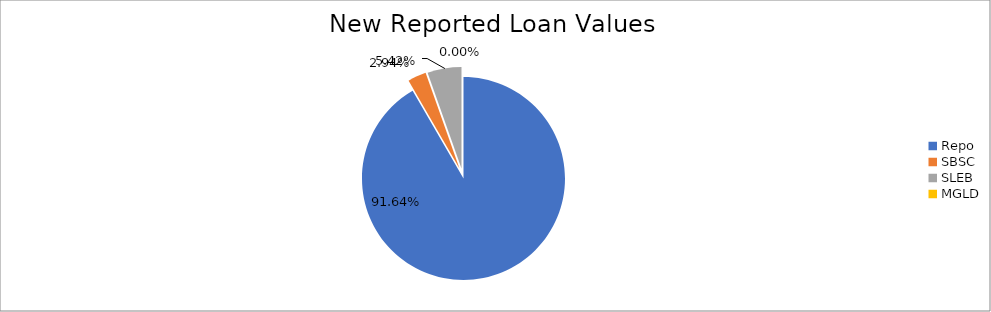
| Category | Series 0 |
|---|---|
| Repo | 8374512.108 |
| SBSC | 268684.44 |
| SLEB | 495174.82 |
| MGLD | 1.926 |